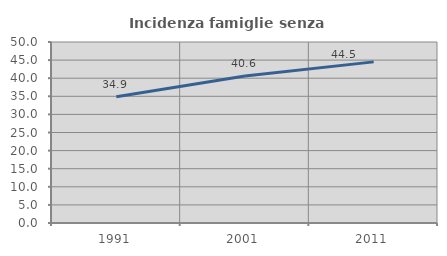
| Category | Incidenza famiglie senza nuclei |
|---|---|
| 1991.0 | 34.904 |
| 2001.0 | 40.6 |
| 2011.0 | 44.508 |